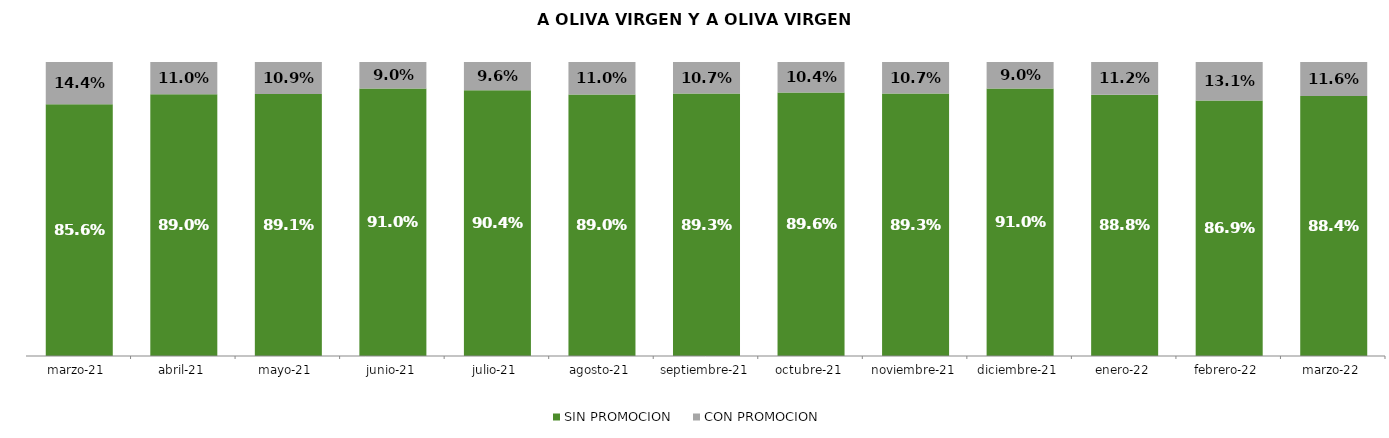
| Category | SIN PROMOCION   | CON PROMOCION   |
|---|---|---|
| 2021-03-01 | 0.856 | 0.144 |
| 2021-04-01 | 0.89 | 0.11 |
| 2021-05-01 | 0.891 | 0.109 |
| 2021-06-01 | 0.91 | 0.09 |
| 2021-07-01 | 0.904 | 0.096 |
| 2021-08-01 | 0.89 | 0.11 |
| 2021-09-01 | 0.893 | 0.107 |
| 2021-10-01 | 0.896 | 0.104 |
| 2021-11-01 | 0.893 | 0.107 |
| 2021-12-01 | 0.91 | 0.09 |
| 2022-01-01 | 0.888 | 0.112 |
| 2022-02-01 | 0.869 | 0.131 |
| 2022-03-01 | 0.884 | 0.116 |